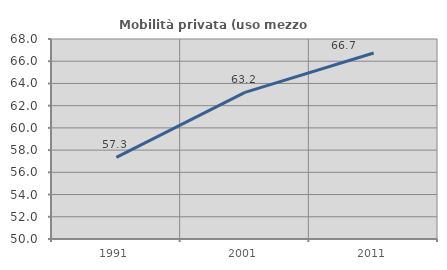
| Category | Mobilità privata (uso mezzo privato) |
|---|---|
| 1991.0 | 57.341 |
| 2001.0 | 63.192 |
| 2011.0 | 66.744 |